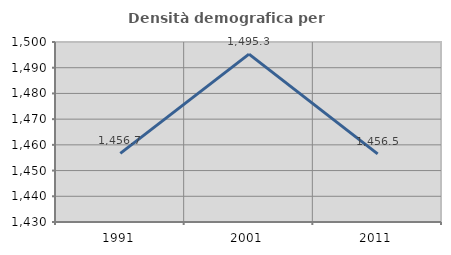
| Category | Densità demografica |
|---|---|
| 1991.0 | 1456.707 |
| 2001.0 | 1495.286 |
| 2011.0 | 1456.494 |